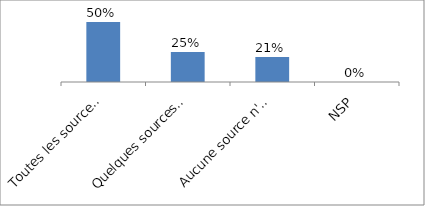
| Category | Series 0 |
|---|---|
| Toutes les sources sont identifiées individuellement | 0.5 |
| Quelques sources sont identifiées | 0.25 |
| Aucune source n'est identifiée | 0.208 |
| NSP | 0 |